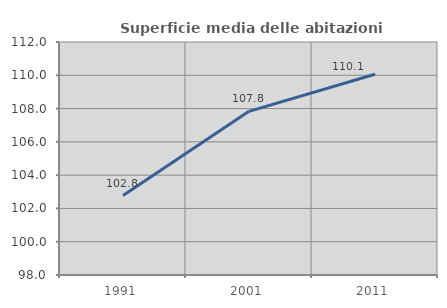
| Category | Superficie media delle abitazioni occupate |
|---|---|
| 1991.0 | 102.773 |
| 2001.0 | 107.834 |
| 2011.0 | 110.064 |